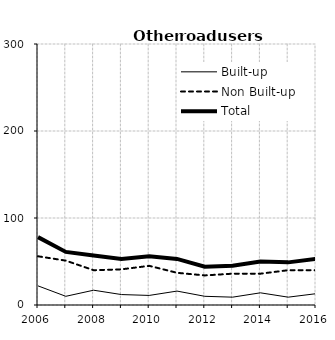
| Category | Built-up | Non Built-up | Total |
|---|---|---|---|
| 2006.0 | 22 | 56 | 78 |
| 2007.0 | 10 | 51 | 61 |
| 2008.0 | 17 | 40 | 57 |
| 2009.0 | 12 | 41 | 53 |
| 2010.0 | 11 | 45 | 56 |
| 2011.0 | 16 | 37 | 53 |
| 2012.0 | 10 | 34 | 44 |
| 2013.0 | 9 | 36 | 45 |
| 2014.0 | 14 | 36 | 50 |
| 2015.0 | 9 | 40 | 49 |
| 2016.0 | 13 | 40 | 53 |